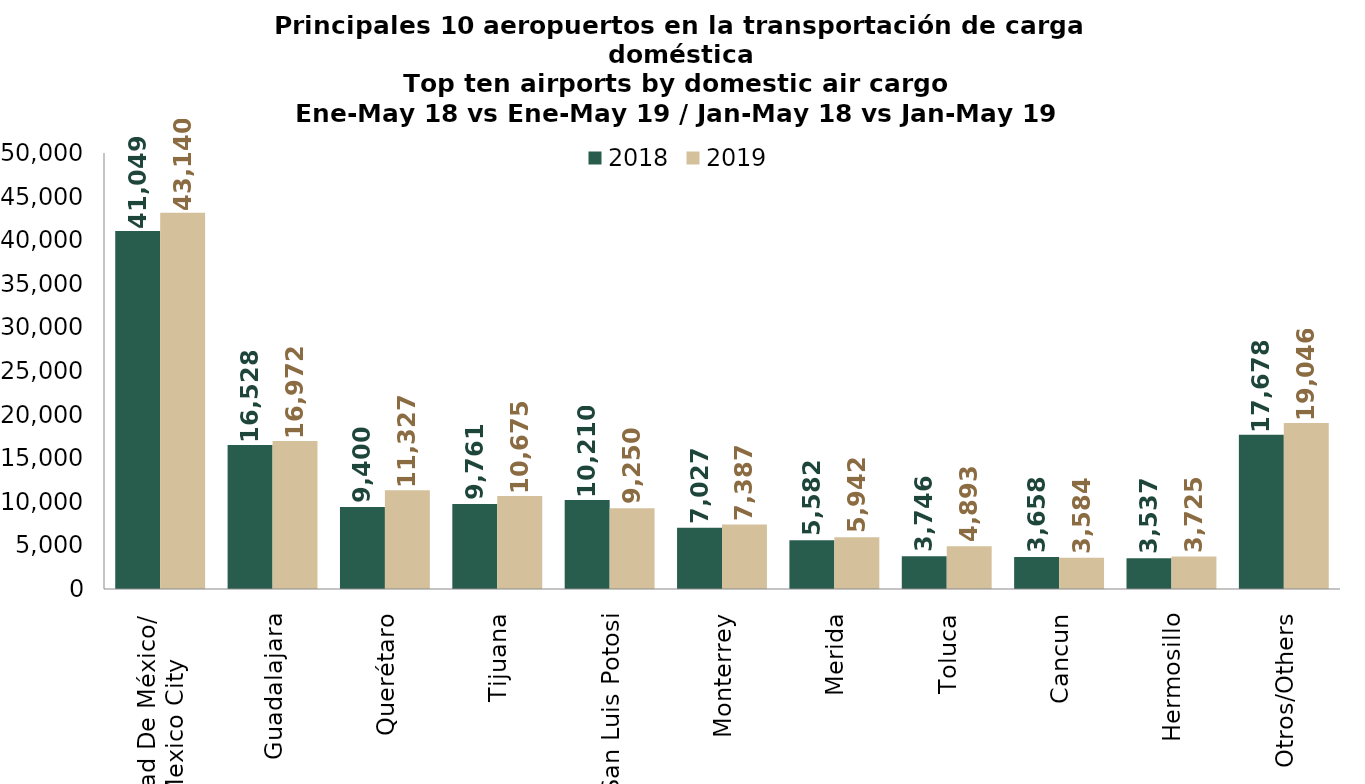
| Category | 2018 | 2019 |
|---|---|---|
| Ciudad De México/
Mexico City | 41049.05 | 43139.99 |
| Guadalajara | 16527.582 | 16972.021 |
| Querétaro | 9399.552 | 11327.395 |
| Tijuana | 9760.644 | 10674.561 |
| San Luis Potosi | 10210.228 | 9249.963 |
| Monterrey | 7027.458 | 7387.235 |
| Merida | 5581.638 | 5942.309 |
| Toluca | 3745.513 | 4893.41 |
| Cancun | 3658.234 | 3583.905 |
| Hermosillo | 3536.87 | 3724.922 |
| Otros/Others | 17677.786 | 19045.635 |